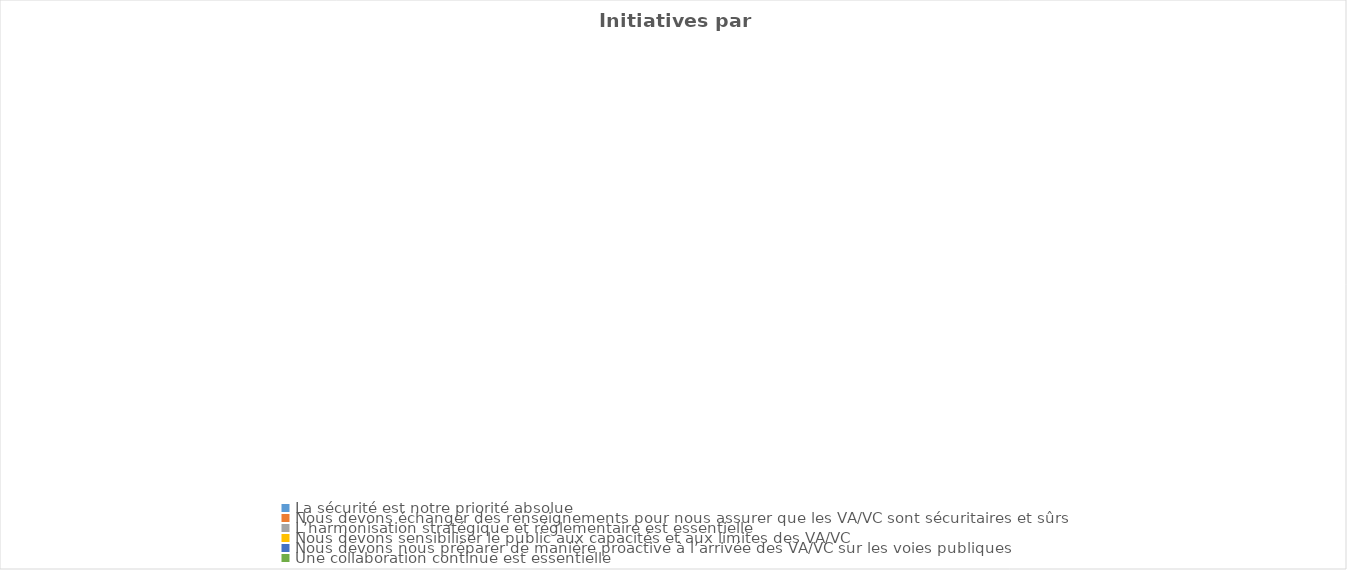
| Category | Initiatives per Principle |
|---|---|
| La sécurité est notre priorité absolue | 0 |
| Nous devons échanger des renseignements pour nous assurer que les VA/VC sont sécuritaires et sûrs | 0 |
| L’harmonisation stratégique et réglementaire est essentielle | 0 |
| Nous devons sensibiliser le public aux capacités et aux limites des VA/VC | 0 |
| Nous devons nous préparer de manière proactive à l’arrivée des VA/VC sur les voies publiques | 0 |
| Une collaboration continue est essentielle | 0 |